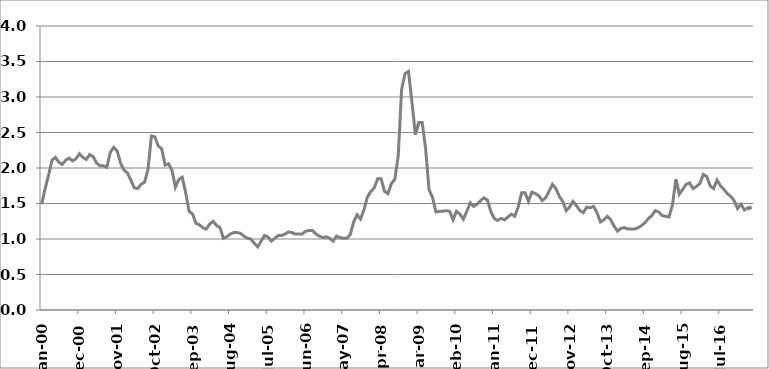
| Category | Series 1 |
|---|---|
| 2000-01-01 | 1.49 |
| 2000-02-01 | 1.71 |
| 2000-03-01 | 1.9 |
| 2000-04-01 | 2.11 |
| 2000-05-01 | 2.15 |
| 2000-06-01 | 2.08 |
| 2000-07-01 | 2.05 |
| 2000-08-01 | 2.11 |
| 2000-09-01 | 2.14 |
| 2000-10-01 | 2.1 |
| 2000-11-01 | 2.13 |
| 2000-12-01 | 2.2 |
| 2001-01-01 | 2.15 |
| 2001-02-01 | 2.12 |
| 2001-03-01 | 2.19 |
| 2001-04-01 | 2.16 |
| 2001-05-01 | 2.07 |
| 2001-06-01 | 2.03 |
| 2001-07-01 | 2.03 |
| 2001-08-01 | 2.01 |
| 2001-09-01 | 2.22 |
| 2001-10-01 | 2.29 |
| 2001-11-01 | 2.24 |
| 2001-12-01 | 2.07 |
| 2002-01-01 | 1.97 |
| 2002-02-01 | 1.93 |
| 2002-03-01 | 1.83 |
| 2002-04-01 | 1.72 |
| 2002-05-01 | 1.71 |
| 2002-06-01 | 1.77 |
| 2002-07-01 | 1.8 |
| 2002-08-01 | 1.98 |
| 2002-09-01 | 2.45 |
| 2002-10-01 | 2.44 |
| 2002-11-01 | 2.31 |
| 2002-12-01 | 2.27 |
| 2003-01-01 | 2.04 |
| 2003-02-01 | 2.06 |
| 2003-03-01 | 1.97 |
| 2003-04-01 | 1.73 |
| 2003-05-01 | 1.84 |
| 2003-06-01 | 1.87 |
| 2003-07-01 | 1.65 |
| 2003-08-01 | 1.39 |
| 2003-09-01 | 1.35 |
| 2003-10-01 | 1.22 |
| 2003-11-01 | 1.2 |
| 2003-12-01 | 1.16 |
| 2004-01-01 | 1.14 |
| 2004-02-01 | 1.21 |
| 2004-03-01 | 1.25 |
| 2004-04-01 | 1.19 |
| 2004-05-01 | 1.16 |
| 2004-06-01 | 1.01 |
| 2004-07-01 | 1.03 |
| 2004-08-01 | 1.07 |
| 2004-09-01 | 1.09 |
| 2004-10-01 | 1.09 |
| 2004-11-01 | 1.08 |
| 2004-12-01 | 1.04 |
| 2005-01-01 | 1.01 |
| 2005-02-01 | 1 |
| 2005-03-01 | 0.94 |
| 2005-04-01 | 0.89 |
| 2005-05-01 | 0.97 |
| 2005-06-01 | 1.05 |
| 2005-07-01 | 1.03 |
| 2005-08-01 | 0.97 |
| 2005-09-01 | 1.01 |
| 2005-10-01 | 1.05 |
| 2005-11-01 | 1.05 |
| 2005-12-01 | 1.07 |
| 2006-01-01 | 1.1 |
| 2006-02-01 | 1.09 |
| 2006-03-01 | 1.07 |
| 2006-04-01 | 1.07 |
| 2006-05-01 | 1.07 |
| 2006-06-01 | 1.11 |
| 2006-07-01 | 1.12 |
| 2006-08-01 | 1.12 |
| 2006-09-01 | 1.07 |
| 2006-10-01 | 1.04 |
| 2006-11-01 | 1.02 |
| 2006-12-01 | 1.03 |
| 2007-01-01 | 1.01 |
| 2007-02-01 | 0.97 |
| 2007-03-01 | 1.04 |
| 2007-04-01 | 1.02 |
| 2007-05-01 | 1.01 |
| 2007-06-01 | 1.01 |
| 2007-07-01 | 1.06 |
| 2007-08-01 | 1.24 |
| 2007-09-01 | 1.34 |
| 2007-10-01 | 1.28 |
| 2007-11-01 | 1.41 |
| 2007-12-01 | 1.59 |
| 2008-01-01 | 1.67 |
| 2008-02-01 | 1.72 |
| 2008-03-01 | 1.85 |
| 2008-04-01 | 1.85 |
| 2008-05-01 | 1.67 |
| 2008-06-01 | 1.64 |
| 2008-07-01 | 1.78 |
| 2008-08-01 | 1.84 |
| 2008-09-01 | 2.17 |
| 2008-10-01 | 3.11 |
| 2008-11-01 | 3.33 |
| 2008-12-01 | 3.36 |
| 2009-01-01 | 2.93 |
| 2009-02-01 | 2.47 |
| 2009-03-01 | 2.64 |
| 2009-04-01 | 2.64 |
| 2009-05-01 | 2.27 |
| 2009-06-01 | 1.69 |
| 2009-07-01 | 1.59 |
| 2009-08-01 | 1.38 |
| 2009-09-01 | 1.39 |
| 2009-10-01 | 1.39 |
| 2009-11-01 | 1.4 |
| 2009-12-01 | 1.39 |
| 2010-01-01 | 1.27 |
| 2010-02-01 | 1.39 |
| 2010-03-01 | 1.35 |
| 2010-04-01 | 1.28 |
| 2010-05-01 | 1.39 |
| 2010-06-01 | 1.51 |
| 2010-07-01 | 1.46 |
| 2010-08-01 | 1.49 |
| 2010-09-01 | 1.54 |
| 2010-10-01 | 1.58 |
| 2010-11-01 | 1.55 |
| 2010-12-01 | 1.39 |
| 2011-01-01 | 1.29 |
| 2011-02-01 | 1.26 |
| 2011-03-01 | 1.29 |
| 2011-04-01 | 1.27 |
| 2011-05-01 | 1.31 |
| 2011-06-01 | 1.35 |
| 2011-07-01 | 1.32 |
| 2011-08-01 | 1.45 |
| 2011-09-01 | 1.65 |
| 2011-10-01 | 1.65 |
| 2011-11-01 | 1.53 |
| 2011-12-01 | 1.66 |
| 2012-01-01 | 1.64 |
| 2012-02-01 | 1.61 |
| 2012-03-01 | 1.54 |
| 2012-04-01 | 1.58 |
| 2012-05-01 | 1.67 |
| 2012-06-01 | 1.77 |
| 2012-07-01 | 1.71 |
| 2012-08-01 | 1.6 |
| 2012-09-01 | 1.53 |
| 2012-10-01 | 1.4 |
| 2012-11-01 | 1.45 |
| 2012-12-01 | 1.53 |
| 2013-01-01 | 1.47 |
| 2013-02-01 | 1.4 |
| 2013-03-01 | 1.37 |
| 2013-04-01 | 1.45 |
| 2013-05-01 | 1.44 |
| 2013-06-01 | 1.46 |
| 2013-07-01 | 1.37 |
| 2013-08-01 | 1.24 |
| 2013-09-01 | 1.27 |
| 2013-10-01 | 1.32 |
| 2013-11-01 | 1.27 |
| 2013-12-01 | 1.18 |
| 2014-01-01 | 1.11 |
| 2014-02-01 | 1.15 |
| 2014-03-01 | 1.16 |
| 2014-04-01 | 1.14 |
| 2014-05-01 | 1.14 |
| 2014-06-01 | 1.14 |
| 2014-07-01 | 1.16 |
| 2014-08-01 | 1.19 |
| 2014-09-01 | 1.23 |
| 2014-10-01 | 1.29 |
| 2014-11-01 | 1.33 |
| 2014-12-01 | 1.4 |
| 2015-01-01 | 1.38 |
| 2015-02-01 | 1.33 |
| 2015-03-01 | 1.32 |
| 2015-04-01 | 1.31 |
| 2015-05-01 | 1.48 |
| 2015-06-01 | 1.84 |
| 2015-07-01 | 1.63 |
| 2015-08-01 | 1.7 |
| 2015-09-01 | 1.77 |
| 2015-10-01 | 1.79 |
| 2015-11-01 | 1.71 |
| 2015-12-01 | 1.74 |
| 2016-01-01 | 1.78 |
| 2016-02-01 | 1.91 |
| 2016-03-01 | 1.88 |
| 2016-04-01 | 1.75 |
| 2016-05-01 | 1.71 |
| 2016-06-01 | 1.83 |
| 2016-07-01 | 1.75 |
| 2016-08-01 | 1.7 |
| 2016-09-01 | 1.64 |
| 2016-10-01 | 1.6 |
| 2016-11-01 | 1.54 |
| 2016-12-01 | 1.43 |
| 2017-01-01 | 1.49 |
| 2017-02-01 | 1.41 |
| 2017-03-01 | 1.44 |
| 2017-04-01 | 1.45 |
| 2017-03-01 | 1.42 |